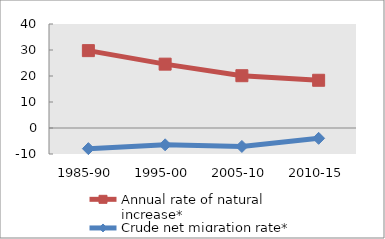
| Category | Annual rate of natural increase* | Crude net migration rate* |
|---|---|---|
| 1985-90 | 29.756 | -7.936 |
| 1995-00 | 24.559 | -6.467 |
| 2005-10 | 20.11 | -7.094 |
| 2010-15 | 18.356 | -3.974 |